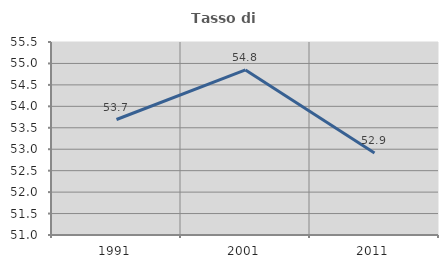
| Category | Tasso di occupazione   |
|---|---|
| 1991.0 | 53.693 |
| 2001.0 | 54.848 |
| 2011.0 | 52.912 |